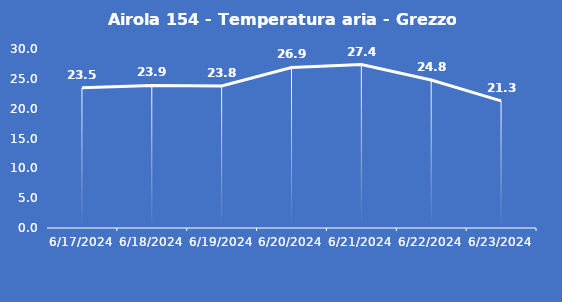
| Category | Airola 154 - Temperatura aria - Grezzo (°C) |
|---|---|
| 6/17/24 | 23.5 |
| 6/18/24 | 23.9 |
| 6/19/24 | 23.8 |
| 6/20/24 | 26.9 |
| 6/21/24 | 27.4 |
| 6/22/24 | 24.8 |
| 6/23/24 | 21.3 |